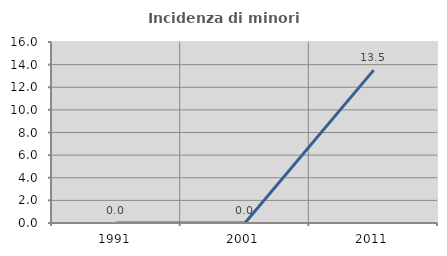
| Category | Incidenza di minori stranieri |
|---|---|
| 1991.0 | 0 |
| 2001.0 | 0 |
| 2011.0 | 13.514 |